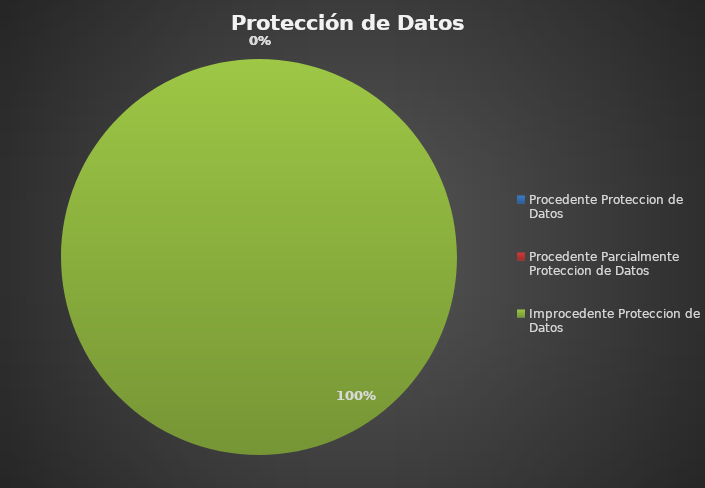
| Category | Series 0 |
|---|---|
| Procedente Proteccion de Datos | 0 |
| Procedente Parcialmente Proteccion de Datos | 0 |
| Improcedente Proteccion de Datos | 1 |